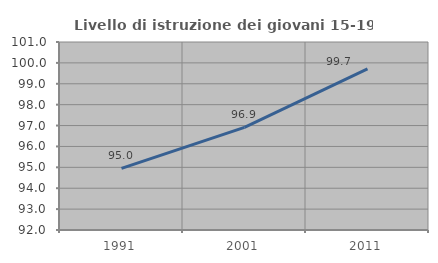
| Category | Livello di istruzione dei giovani 15-19 anni |
|---|---|
| 1991.0 | 94.951 |
| 2001.0 | 96.912 |
| 2011.0 | 99.713 |